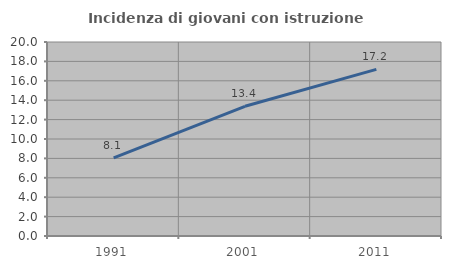
| Category | Incidenza di giovani con istruzione universitaria |
|---|---|
| 1991.0 | 8.054 |
| 2001.0 | 13.372 |
| 2011.0 | 17.178 |